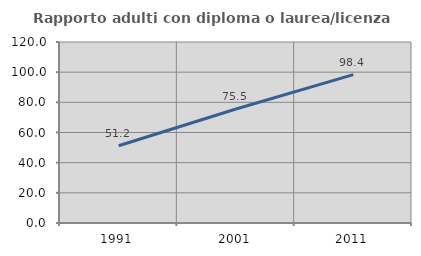
| Category | Rapporto adulti con diploma o laurea/licenza media  |
|---|---|
| 1991.0 | 51.22 |
| 2001.0 | 75.546 |
| 2011.0 | 98.406 |